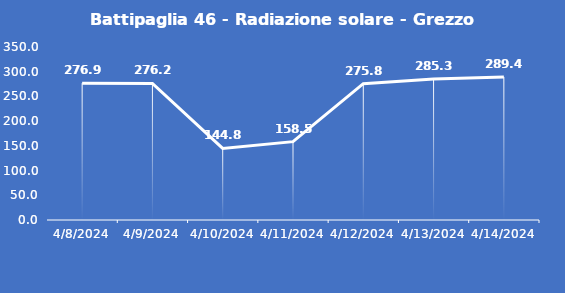
| Category | Battipaglia 46 - Radiazione solare - Grezzo (W/m2) |
|---|---|
| 4/8/24 | 276.9 |
| 4/9/24 | 276.2 |
| 4/10/24 | 144.8 |
| 4/11/24 | 158.5 |
| 4/12/24 | 275.8 |
| 4/13/24 | 285.3 |
| 4/14/24 | 289.4 |